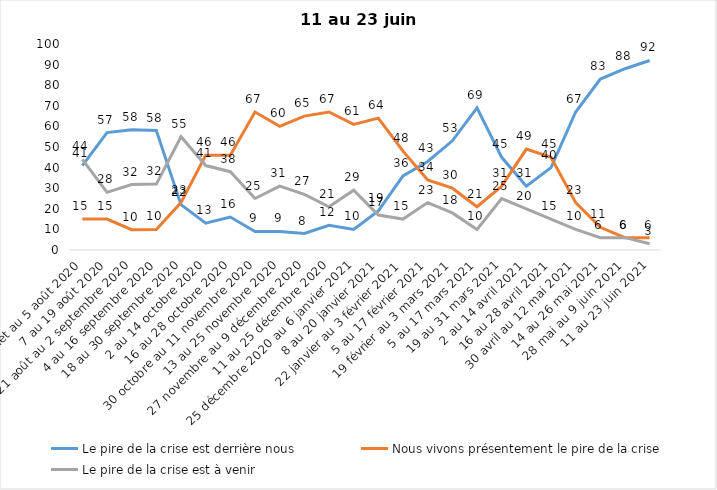
| Category | Le pire de la crise est derrière nous | Nous vivons présentement le pire de la crise | Le pire de la crise est à venir |
|---|---|---|---|
| 24 juillet au 5 août 2020 | 41 | 15 | 44 |
| 7 au 19 août 2020 | 57 | 15 | 28 |
| 21 août au 2 septembre 2020 | 58.39 | 9.84 | 31.77 |
| 4 au 16 septembre 2020 | 58 | 10 | 32 |
| 18 au 30 septembre 2020 | 22 | 23 | 55 |
| 2 au 14 octobre 2020 | 13 | 46 | 41 |
| 16 au 28 octobre 2020 | 16 | 46 | 38 |
| 30 octobre au 11 novembre 2020 | 9 | 67 | 25 |
| 13 au 25 novembre 2020 | 9 | 60 | 31 |
| 27 novembre au 9 décembre 2020 | 8 | 65 | 27 |
| 11 au 25 décembre 2020 | 12 | 67 | 21 |
| 25 décembre 2020 au 6 janvier 2021 | 10 | 61 | 29 |
| 8 au 20 janvier 2021 | 19 | 64 | 17 |
| 22 janvier au 3 février 2021 | 36 | 48 | 15 |
| 5 au 17 février 2021 | 43 | 34 | 23 |
| 19 février au 3 mars 2021 | 53 | 30 | 18 |
| 5 au 17 mars 2021 | 69 | 21 | 10 |
| 19 au 31 mars 2021 | 45 | 31 | 25 |
| 2 au 14 avril 2021 | 31 | 49 | 20 |
| 16 au 28 avril 2021 | 40 | 45 | 15 |
| 30 avril au 12 mai 2021 | 67 | 23 | 10 |
| 14 au 26 mai 2021 | 83 | 11 | 6 |
| 28 mai au 9 juin 2021 | 88 | 6 | 6 |
| 11 au 23 juin 2021 | 92 | 6 | 3 |